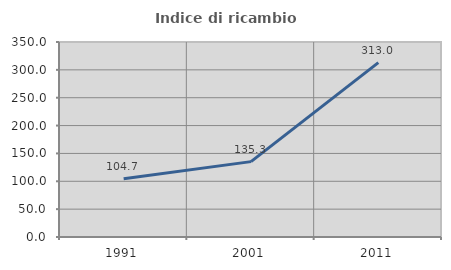
| Category | Indice di ricambio occupazionale  |
|---|---|
| 1991.0 | 104.651 |
| 2001.0 | 135.294 |
| 2011.0 | 313.043 |